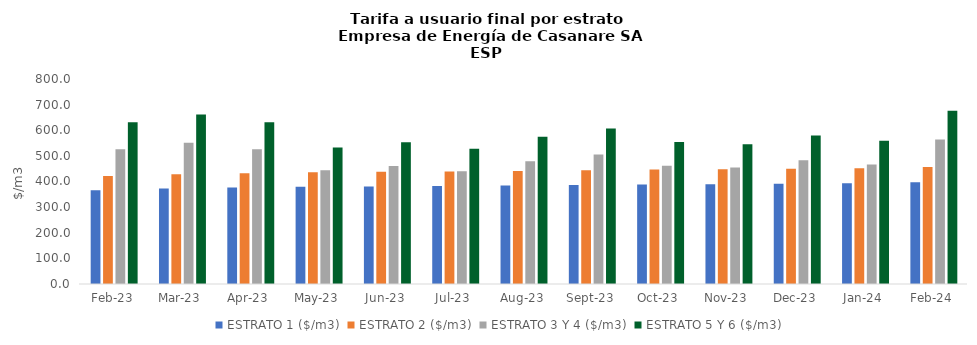
| Category | ESTRATO 1 ($/m3) | ESTRATO 2 ($/m3) | ESTRATO 3 Y 4 ($/m3) | ESTRATO 5 Y 6 ($/m3) |
|---|---|---|---|---|
| 2023-02-01 | 366.33 | 421 | 525.703 | 630.843 |
| 2023-03-01 | 372.41 | 428 | 551.417 | 661.7 |
| 2023-04-01 | 376.32 | 432.49 | 525.703 | 630.843 |
| 2023-05-01 | 379.26 | 435.87 | 444.034 | 532.841 |
| 2023-06-01 | 380.92 | 437.78 | 460.92 | 553.104 |
| 2023-07-01 | 382.06 | 439.09 | 440.108 | 528.13 |
| 2023-08-01 | 383.97 | 441.29 | 479.093 | 574.912 |
| 2023-09-01 | 386.66 | 444.37 | 505.302 | 606.362 |
| 2023-10-01 | 388.72 | 446.74 | 461.695 | 554.034 |
| 2023-11-01 | 389.69 | 447.85 | 454.34 | 545.208 |
| 2023-12-01 | 391.51 | 449.95 | 483.31 | 579.972 |
| 2024-01-01 | 393.31 | 452.02 | 465.872 | 559.047 |
| 2024-02-01 | 396.91 | 456.16 | 563.437 | 676.124 |